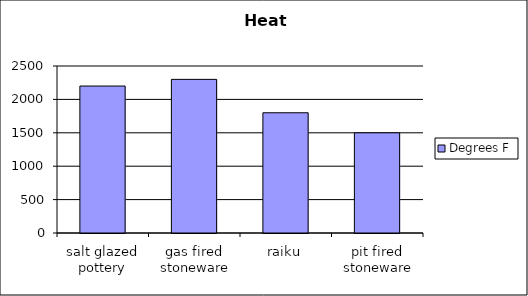
| Category | Degrees F |
|---|---|
| salt glazed pottery | 2200 |
| gas fired stoneware | 2300 |
| raiku | 1800 |
| pit fired stoneware | 1500 |